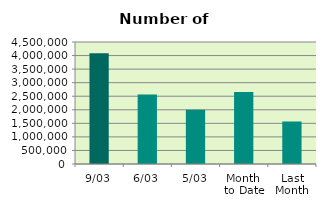
| Category | Series 0 |
|---|---|
| 9/03 | 4089124 |
| 6/03 | 2563946 |
| 5/03 | 1997734 |
| Month 
to Date | 2651561.667 |
| Last
Month | 1567888.4 |